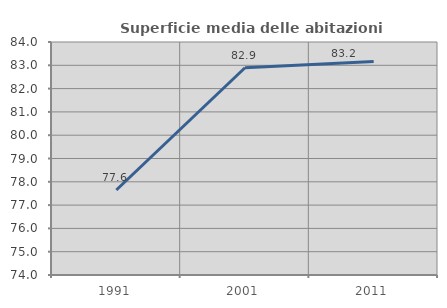
| Category | Superficie media delle abitazioni occupate |
|---|---|
| 1991.0 | 77.649 |
| 2001.0 | 82.895 |
| 2011.0 | 83.165 |